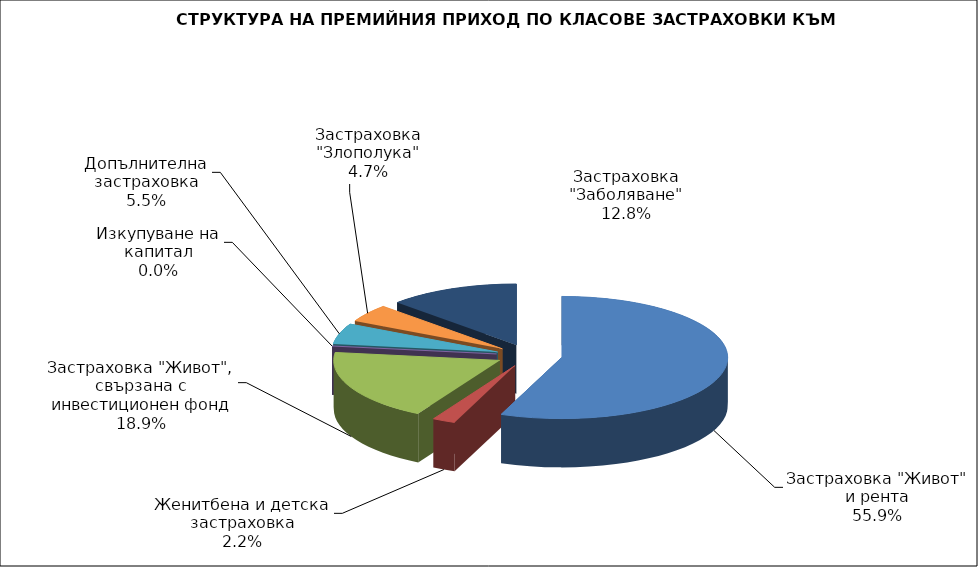
| Category | Series 0 |
|---|---|
| Застраховка "Живот" и рента | 164991544.287 |
| Женитбена и детска застраховка | 6593851.763 |
| Застраховка "Живот", свързана с инвестиционен фонд | 55754305.054 |
| Изкупуване на капитал | 0 |
| Допълнителна застраховка | 16195556.963 |
| Застраховка "Злополука" | 13778806.08 |
| Застраховка "Заболяване" | 37627631.04 |